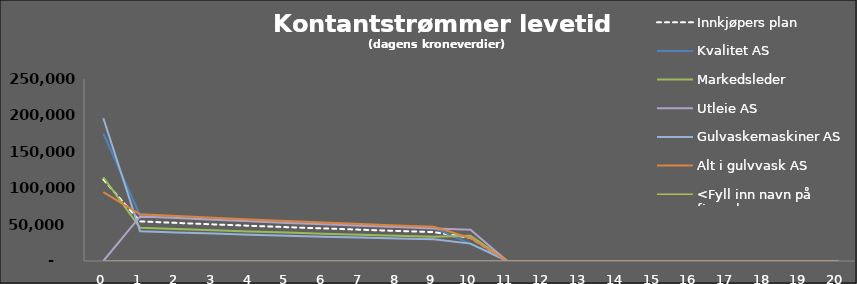
| Category |  Innkjøpers plan  |  Kvalitet AS  |  Markedsleder  |  Utleie AS  |  Gulvaskemaskiner AS  |  Alt i gulvvask AS  |  <Fyll inn navn på firma her>  |
|---|---|---|---|---|---|---|---|
| 0 | 112000 | 175000 | 115000 | 0 | 196000 | 94500 | 0 |
| 1 | 54402.885 | 62474.231 | 45674.769 | 61258.462 | 40702.692 | 64188.077 | 0 |
| 2 | 52310.466 | 60071.376 | 43918.047 | 58902.367 | 39137.204 | 61719.305 | 0 |
| 3 | 50298.525 | 57760.938 | 42228.892 | 56636.891 | 37631.927 | 59345.485 | 0 |
| 4 | 48363.966 | 55539.364 | 40604.704 | 54458.549 | 36184.545 | 57062.967 | 0 |
| 5 | 46503.814 | 53403.234 | 39042.984 | 52363.99 | 34792.832 | 54868.237 | 0 |
| 6 | 44715.206 | 51349.264 | 37541.331 | 50349.99 | 33454.646 | 52757.92 | 0 |
| 7 | 42995.39 | 49374.292 | 36097.434 | 48413.452 | 32167.929 | 50728.77 | 0 |
| 8 | 41341.721 | 47475.281 | 34709.071 | 46551.396 | 30930.701 | 48777.663 | 0 |
| 9 | 39751.655 | 45649.308 | 33374.106 | 44760.958 | 29741.059 | 46901.599 | 0 |
| 10 | 31737.329 | 23626.641 | 34792.744 | 43039.383 | 23868.223 | 31586.408 | 0 |
| 11 | 0 | 0 | 0 | 0 | 0 | 0 | 0 |
| 12 | 0 | 0 | 0 | 0 | 0 | 0 | 0 |
| 13 | 0 | 0 | 0 | 0 | 0 | 0 | 0 |
| 14 | 0 | 0 | 0 | 0 | 0 | 0 | 0 |
| 15 | 0 | 0 | 0 | 0 | 0 | 0 | 0 |
| 16 | 0 | 0 | 0 | 0 | 0 | 0 | 0 |
| 17 | 0 | 0 | 0 | 0 | 0 | 0 | 0 |
| 18 | 0 | 0 | 0 | 0 | 0 | 0 | 0 |
| 19 | 0 | 0 | 0 | 0 | 0 | 0 | 0 |
| 20 | 0 | 0 | 0 | 0 | 0 | 0 | 0 |